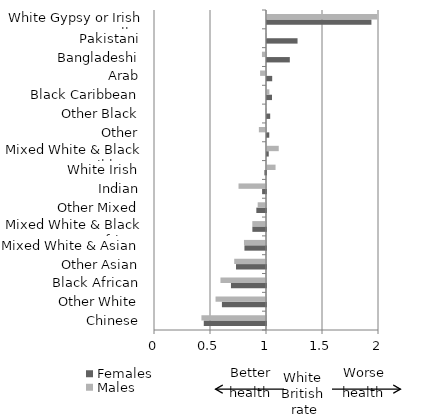
| Category | Females  | Males  |
|---|---|---|
| Chinese | 0.444 | 0.423 |
| Other White | 0.607 | 0.549 |
| Black African | 0.687 | 0.593 |
| Other Asian | 0.732 | 0.716 |
| Mixed White & Asian | 0.807 | 0.803 |
| Mixed White & Black African | 0.878 | 0.878 |
| Other Mixed | 0.914 | 0.926 |
| Indian | 0.965 | 0.755 |
| White Irish | 0.986 | 1.076 |
| Mixed White & Black Caribbean | 1.016 | 1.105 |
| Other | 1.02 | 0.936 |
| Other Black | 1.029 | 0.992 |
| Black Caribbean | 1.045 | 1.021 |
| Arab | 1.046 | 0.947 |
| Bangladeshi | 1.204 | 0.964 |
| Pakistani | 1.273 | 0.996 |
| White Gypsy or Irish Traveller | 1.932 | 1.985 |